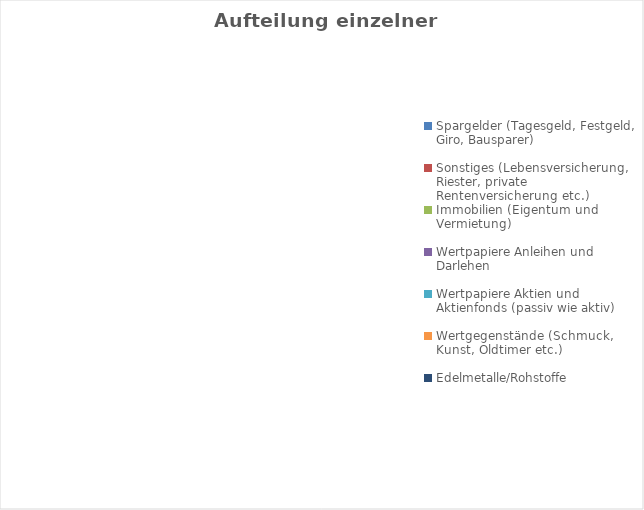
| Category | Series 0 | Series 1 |
|---|---|---|
| Spargelder (Tagesgeld, Festgeld, Giro, Bausparer) | 0 | 0 |
| Sonstiges (Lebensversicherung, Riester, private Rentenversicherung etc.) | 0 | 0 |
| Immobilien (Eigentum und Vermietung) | 0 | 0 |
| Wertpapiere Anleihen und Darlehen | 0 | 0 |
| Wertpapiere Aktien und Aktienfonds (passiv wie aktiv) | 0 | 0 |
| Wertgegenstände (Schmuck, Kunst, Oldtimer etc.) | 0 | 0 |
| Edelmetalle/Rohstoffe | 0 | 0 |